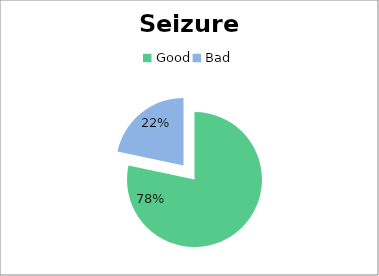
| Category | Series 0 |
|---|---|
| Good | 142059.64 |
| Bad | 39340.36 |